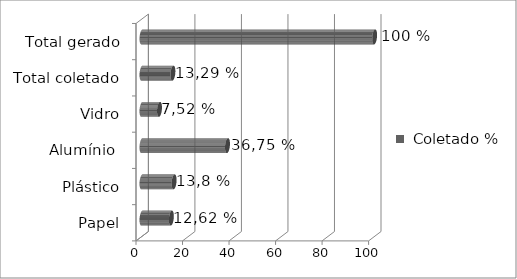
| Category |  Coletado % |
|---|---|
| Papel | 12.62 |
| Plástico | 13.8 |
| Alumínio  | 36.75 |
| Vidro | 7.52 |
| Total coletado | 13.29 |
| Total gerado | 100 |